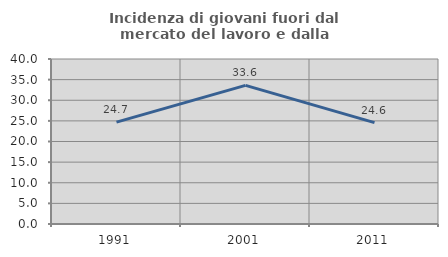
| Category | Incidenza di giovani fuori dal mercato del lavoro e dalla formazione  |
|---|---|
| 1991.0 | 24.706 |
| 2001.0 | 33.618 |
| 2011.0 | 24.565 |